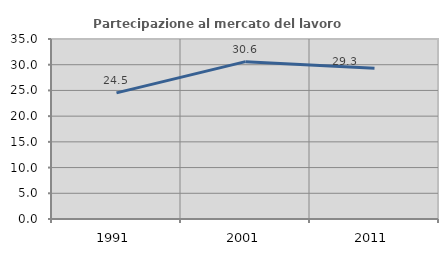
| Category | Partecipazione al mercato del lavoro  femminile |
|---|---|
| 1991.0 | 24.521 |
| 2001.0 | 30.6 |
| 2011.0 | 29.319 |